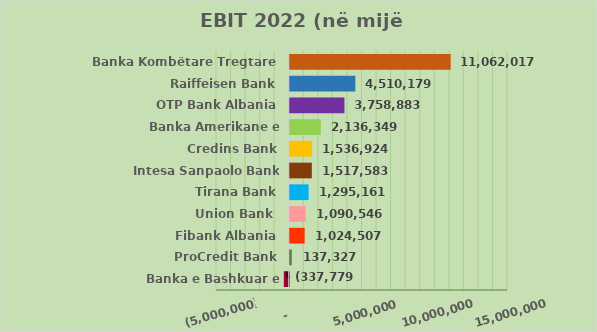
| Category | EBIT 2022 (në mijë Lekë) |
|---|---|
| Banka e Bashkuar e Shqipërisë | -337779 |
| ProCredit Bank | 137327 |
| Fibank Albania | 1024507 |
| Union Bank  | 1090546 |
| Tirana Bank | 1295161 |
| Intesa Sanpaolo Bank Albania | 1517583 |
| Credins Bank | 1536924 |
| Banka Amerikane e Investimeve | 2136349 |
| OTP Bank Albania | 3758883 |
| Raiffeisen Bank | 4510179 |
| Banka Kombëtare Tregtare | 11062017 |